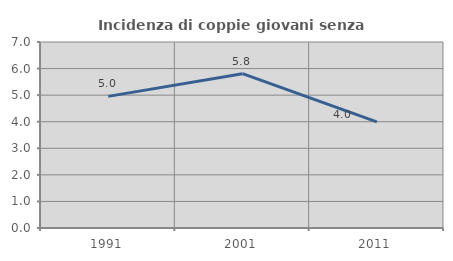
| Category | Incidenza di coppie giovani senza figli |
|---|---|
| 1991.0 | 4.954 |
| 2001.0 | 5.808 |
| 2011.0 | 3.993 |